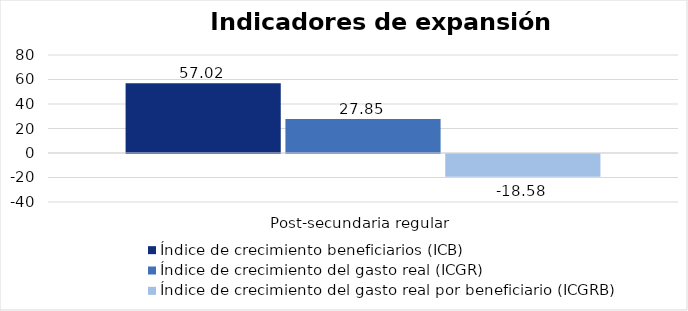
| Category | Índice de crecimiento beneficiarios (ICB)  | Índice de crecimiento del gasto real (ICGR)  | Índice de crecimiento del gasto real por beneficiario (ICGRB)  |
|---|---|---|---|
| Post-secundaria regular  | 57.023 | 27.849 | -18.58 |